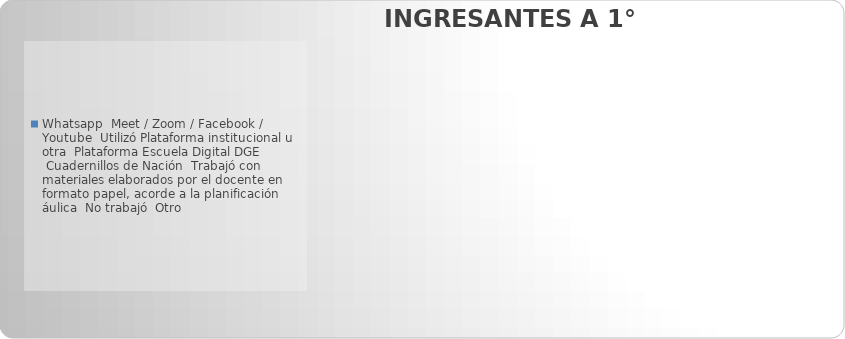
| Category | Whatsapp |
|---|---|
| Whatsapp | 0 |
|  Meet / Zoom / Facebook / Youtube | 0 |
|  Utilizó Plataforma institucional u otra | 0 |
|  Plataforma Escuela Digital DGE | 0 |
|  Cuadernillos de Nación | 0 |
|  Trabajó con materiales elaborados por el docente en formato papel, acorde a la planificación áulica | 0 |
|  No trabajó | 0 |
|  Otro  | 0 |